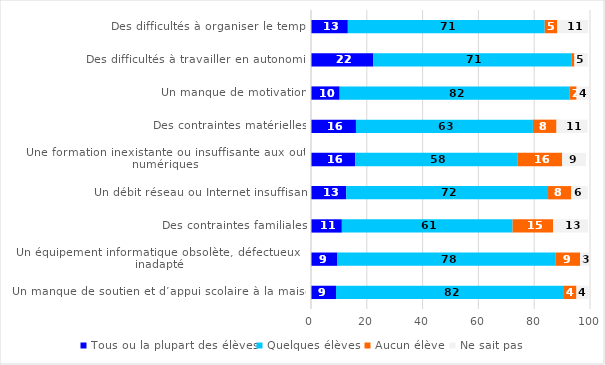
| Category | Tous ou la plupart des élèves | Quelques élèves | Aucun élève | Ne sait pas |
|---|---|---|---|---|
| Des difficultés à organiser le temps | 13.205 | 70.561 | 4.522 | 11.088 |
| Des difficultés à travailler en autonomie | 22.251 | 71.03 | 1.138 | 4.771 |
| Un manque de motivation | 10.284 | 82.476 | 2.433 | 4.376 |
| Des contraintes matérielles | 16.11 | 63.429 | 8.462 | 11.078 |
| Une formation inexistante ou insuffisante aux outils numériques | 15.83 | 58.101 | 16.082 | 8.54 |
| Un débit réseau ou Internet insuffisant | 12.625 | 72.337 | 8.348 | 5.876 |
| Des contraintes familiales | 11.056 | 61.195 | 14.528 | 12.56 |
| Un équipement informatique obsolète, défectueux ou inadapté | 9.489 | 78.266 | 8.719 | 3.251 |
| Un manque de soutien et d’appui scolaire à la maison | 8.976 | 81.69 | 4.488 | 4.364 |